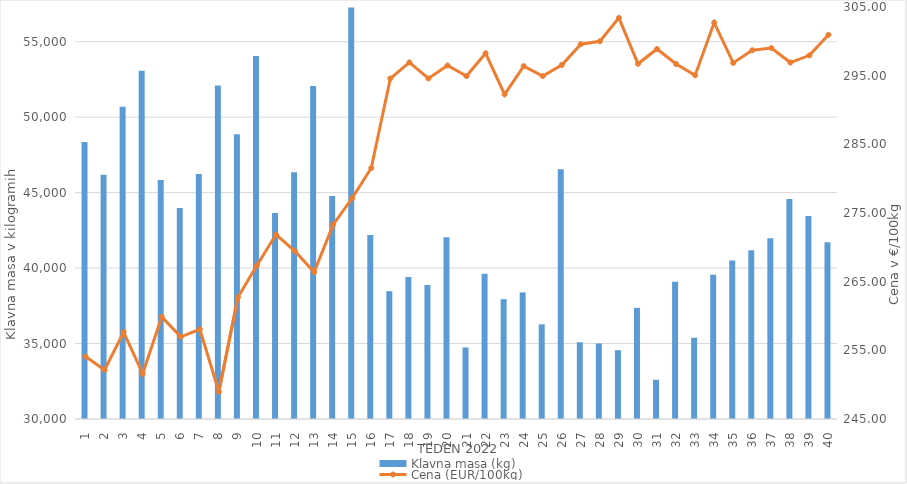
| Category | Klavna masa (kg) |
|---|---|
| 1.0 | 48349 |
| 2.0 | 46187 |
| 3.0 | 50692 |
| 4.0 | 53081 |
| 5.0 | 45844 |
| 6.0 | 43982 |
| 7.0 | 46227 |
| 8.0 | 52099 |
| 9.0 | 48872 |
| 10.0 | 54045 |
| 11.0 | 43645 |
| 12.0 | 46350 |
| 13.0 | 52061 |
| 14.0 | 44774 |
| 15.0 | 57268 |
| 16.0 | 42191 |
| 17.0 | 38469 |
| 18.0 | 39417 |
| 19.0 | 38876 |
| 20.0 | 42047 |
| 21.0 | 34739 |
| 22.0 | 39626 |
| 23.0 | 37939 |
| 24.0 | 38390 |
| 25.0 | 36272 |
| 26.0 | 46553 |
| 27.0 | 35085 |
| 28.0 | 35007 |
| 29.0 | 34559 |
| 30.0 | 37366 |
| 31.0 | 32599 |
| 32.0 | 39100 |
| 33.0 | 35388 |
| 34.0 | 39563 |
| 35.0 | 40507 |
| 36.0 | 41176 |
| 37.0 | 41983 |
| 38.0 | 44572 |
| 39.0 | 43447 |
| 40.0 | 41711 |